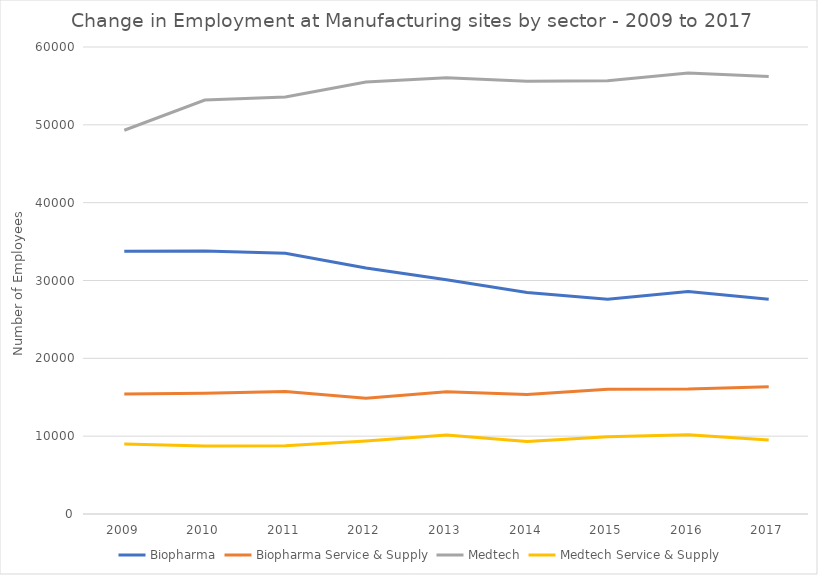
| Category | Biopharma | Biopharma Service & Supply | Medtech | Medtech Service & Supply |
|---|---|---|---|---|
| 2009 | 33761 | 15425 | 49307 | 8998 |
| 2010 | 33781 | 15507 | 53176 | 8730 |
| 2011 | 33501 | 15726 | 53568 | 8783 |
| 2012 | 31602 | 14872 | 55497 | 9383 |
| 2013 | 30090 | 15705 | 56065 | 10134 |
| 2014 | 28449 | 15361 | 55605 | 9305 |
| 2015 | 27602 | 16037 | 55666 | 9922 |
| 2016 | 28580 | 16050 | 56648 | 10169 |
| 2017 | 27587 | 16335 | 56211 | 9518 |